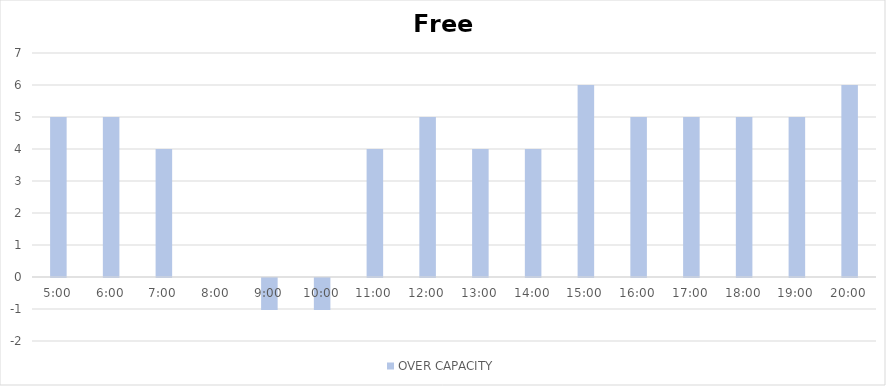
| Category | OVER CAPACITY |
|---|---|
| 0.20833333333333334 | 5 |
| 0.25 | 5 |
| 0.2916666666666667 | 4 |
| 0.3333333333333333 | 0 |
| 0.375 | -1 |
| 0.4166666666666667 | -1 |
| 0.4583333333333333 | 4 |
| 0.5 | 5 |
| 0.5416666666666666 | 4 |
| 0.5833333333333334 | 4 |
| 0.625 | 6 |
| 0.6666666666666666 | 5 |
| 0.7083333333333334 | 5 |
| 0.75 | 5 |
| 0.7916666666666666 | 5 |
| 0.8333333333333334 | 6 |